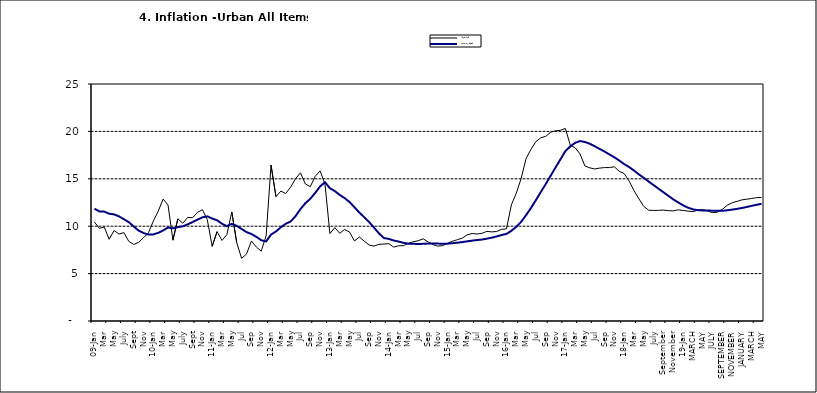
| Category | Year-on Rate | 12-Month Average |
|---|---|---|
| 09-Jan | 10.439 | 11.844 |
| Feb | 9.772 | 11.562 |
| Mar | 9.907 | 11.538 |
| Apr | 8.618 | 11.319 |
| May | 9.547 | 11.246 |
| June | 9.17 | 11.039 |
| July | 9.325 | 10.738 |
| Aug | 8.401 | 10.424 |
| Sept | 8.07 | 9.973 |
| Oct | 8.3 | 9.535 |
| Nov | 8.781 | 9.278 |
| Dec | 9.298 | 9.117 |
| 10-Jan | 10.534 | 9.136 |
| Feb | 11.584 | 9.297 |
| Mar | 12.864 | 9.555 |
| Apr | 12.24 | 9.859 |
| May | 8.524 | 9.769 |
| June | 10.781 | 9.904 |
| July | 10.313 | 9.987 |
| Aug | 10.924 | 10.197 |
| Sept | 10.891 | 10.43 |
| Oct | 11.457 | 10.689 |
| Nov | 11.748 | 10.932 |
| Dec | 10.699 | 11.042 |
| 11-Jan | 7.878 | 10.806 |
| Feb | 9.426 | 10.623 |
| Mar | 8.498 | 10.26 |
| Apr | 9.11 | 10.005 |
| May | 11.5 | 10.249 |
| Jun | 8.278 | 10.034 |
| Jul | 6.608 | 9.711 |
| Aug | 7.061 | 9.38 |
| Sep | 8.443 | 9.178 |
| Oct | 7.802 | 8.88 |
| Nov | 7.365 | 8.525 |
| Dec | 8.993 | 8.395 |
| 12-Jan | 16.445 | 9.119 |
| Feb | 13.123 | 9.443 |
| Mar | 13.701 | 9.889 |
| Apr | 13.447 | 10.259 |
| May | 14.127 | 10.496 |
| Jun | 15.012 | 11.062 |
| Jul | 15.63 | 11.81 |
| Aug | 14.456 | 12.422 |
| Sep | 14.162 | 12.893 |
| Oct | 15.26 | 13.506 |
| Nov | 15.836 | 14.199 |
| Dec | 14.459 | 14.637 |
| 13-Jan | 9.22 | 14.006 |
| Feb | 9.85 | 13.703 |
| Mar | 9.253 | 13.302 |
| Apr | 9.657 | 12.966 |
| May | 9.385 | 12.557 |
| Jun | 8.441 | 11.999 |
| Jul | 8.849 | 11.443 |
| Aug | 8.431 | 10.946 |
| Sep | 8.013 | 10.44 |
| Oct | 7.9 | 9.849 |
| Nov | 8.086 | 9.245 |
| Dec | 8.117 | 8.75 |
| 14-Jan | 8.164 | 8.662 |
| Feb | 7.791 | 8.493 |
| Mar | 7.937 | 8.384 |
| Apr | 7.947 | 8.246 |
| May | 8.195 | 8.151 |
| Jun | 8.358 | 8.146 |
| Jul | 8.464 | 8.118 |
| Aug | 8.673 | 8.141 |
| Sep | 8.357 | 8.17 |
| Oct | 8.064 | 8.182 |
| Nov | 7.902 | 8.165 |
| Dec | 7.948 | 8.151 |
| 15-Jan | 8.211 | 8.155 |
| Feb | 8.412 | 8.206 |
| Mar | 8.579 | 8.26 |
| Apr | 8.742 | 8.326 |
| May | 9.092 | 8.403 |
| Jun | 9.232 | 8.478 |
| Jul | 9.177 | 8.54 |
| Aug | 9.25 | 8.591 |
| Sep | 9.455 | 8.684 |
| Oct | 9.398 | 8.795 |
| Nov | 9.442 | 8.922 |
| Dec | 9.665 | 9.064 |
| 16-Jan | 9.728 | 9.19 |
| Feb | 12.254 | 9.516 |
| Mar | 13.485 | 9.935 |
| Apr | 15.052 | 10.474 |
| May | 17.148 | 11.165 |
| Jun | 18.111 | 11.925 |
| Jul | 18.927 | 12.754 |
| Aug | 19.325 | 13.605 |
| Sep | 19.476 | 14.444 |
| Oct | 19.914 | 15.318 |
| Nov | 20.067 | 16.193 |
| Dec | 20.118 | 17.05 |
| 17-Jan | 20.315 | 17.914 |
| Feb | 18.569 | 18.418 |
| Mar | 18.27 | 18.794 |
| Apr | 17.621 | 18.982 |
| May | 16.343 | 18.883 |
| Jun | 16.153 | 18.692 |
| Jul | 16.038 | 18.43 |
| Aug | 16.128 | 18.151 |
| Sep | 16.183 | 17.872 |
| Oct | 16.187 | 17.567 |
| Nov | 16.267 | 17.264 |
| Dec | 15.785 | 16.921 |
| 18-Jan | 15.559 | 16.55 |
| Feb | 14.763 | 16.241 |
| Mar | 13.748 | 15.866 |
| Apr | 12.893 | 15.468 |
| May | 12.077 | 15.096 |
| June | 11.683 | 14.706 |
| July | 11.661 | 14.329 |
| August | 11.673 | 13.951 |
| September | 11.697 | 13.578 |
| October | 11.64 | 13.206 |
| November | 11.615 | 12.831 |
| December | 11.731 | 12.509 |
| 19-Jan | 11.664 | 12.203 |
| February | 11.592 | 11.954 |
| MARCH | 11.535 | 11.78 |
| APRIL | 11.696 | 11.686 |
| MAY | 11.756 | 11.662 |
| JUNE | 11.605 | 11.655 |
| JULY | 11.432 | 11.635 |
| AUGUST | 11.479 | 11.618 |
| SEPTEMBER | 11.776 | 11.626 |
| OCTOBER | 12.202 | 11.676 |
| NOVEMBER | 12.469 | 11.75 |
| DECEMBER | 12.617 | 11.827 |
| JANUARY | 12.779 | 11.923 |
| FEBRUARY | 12.847 | 12.03 |
| MARCH | 12.932 | 12.147 |
| APRIL | 13.008 | 12.258 |
| MAY | 13.033 | 12.365 |